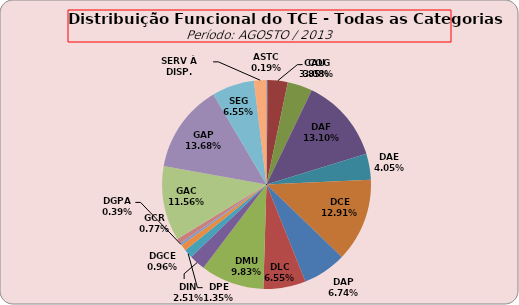
| Category | ASTC COG CAU DAF DAE DCE DAP DLC DMU DIN DPE DGCE DGPA GCR GAC GAP SEG SERV À DISP. |
|---|---|
| ASTC | 1 |
| COG | 16 |
| CAU | 20 |
| DAF | 68 |
| DAE | 21 |
| DCE | 67 |
| DAP | 35 |
| DLC | 34 |
| DMU | 51 |
| DIN | 13 |
| DPE | 7 |
| DGCE | 5 |
| DGPA | 2 |
| GCR | 4 |
| GAC | 60 |
| GAP | 71 |
| SEG | 34 |
| SERV À DISP. | 10 |